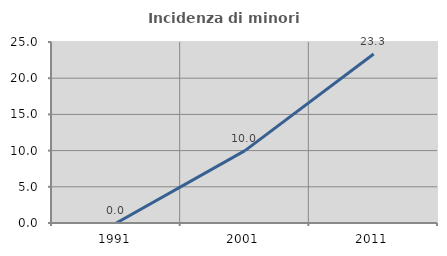
| Category | Incidenza di minori stranieri |
|---|---|
| 1991.0 | 0 |
| 2001.0 | 10 |
| 2011.0 | 23.333 |